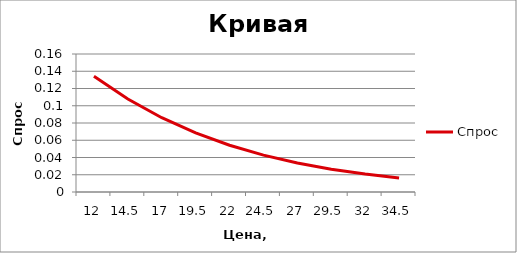
| Category | Спрос |
|---|---|
| 12.0 | 0.134 |
| 14.5 | 0.108 |
| 17.0 | 0.086 |
| 19.5 | 0.068 |
| 22.0 | 0.054 |
| 24.5 | 0.043 |
| 27.0 | 0.034 |
| 29.5 | 0.026 |
| 32.0 | 0.021 |
| 34.5 | 0.016 |